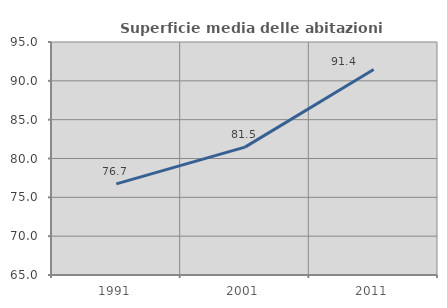
| Category | Superficie media delle abitazioni occupate |
|---|---|
| 1991.0 | 76.734 |
| 2001.0 | 81.461 |
| 2011.0 | 91.448 |